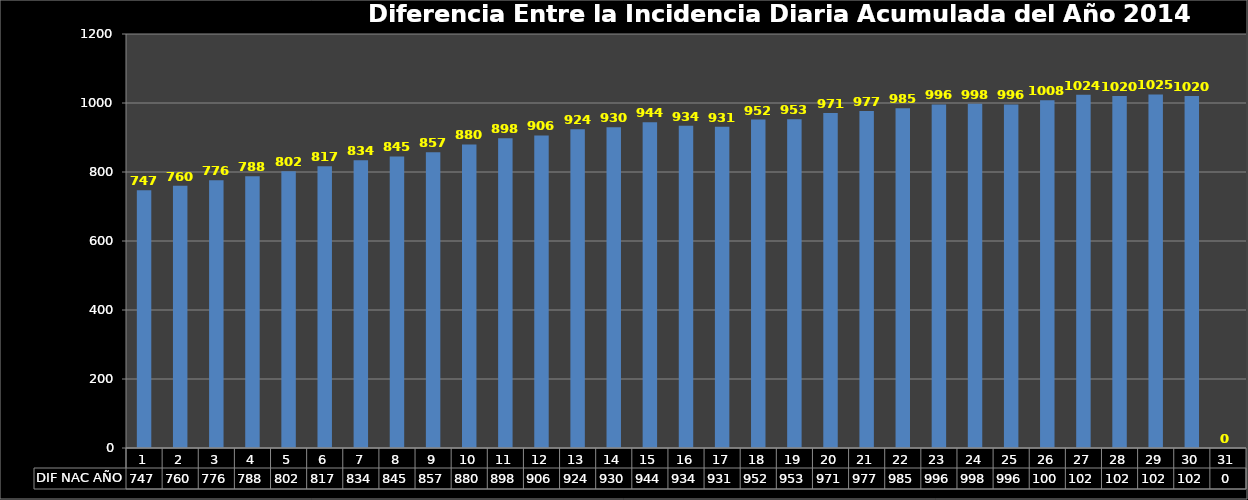
| Category | DIF NAC AÑO |
|---|---|
| 0 | 747 |
| 1 | 760 |
| 2 | 776 |
| 3 | 788 |
| 4 | 802 |
| 5 | 817 |
| 6 | 834 |
| 7 | 845 |
| 8 | 857 |
| 9 | 880 |
| 10 | 898 |
| 11 | 906 |
| 12 | 924 |
| 13 | 930 |
| 14 | 944 |
| 15 | 934 |
| 16 | 931 |
| 17 | 952 |
| 18 | 953 |
| 19 | 971 |
| 20 | 977 |
| 21 | 985 |
| 22 | 996 |
| 23 | 998 |
| 24 | 996 |
| 25 | 1008 |
| 26 | 1024 |
| 27 | 1020 |
| 28 | 1025 |
| 29 | 1020 |
| 30 | 0 |